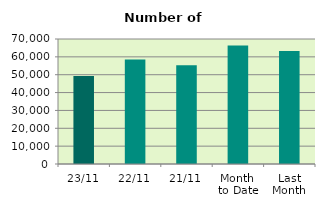
| Category | Series 0 |
|---|---|
| 23/11 | 49308 |
| 22/11 | 58486 |
| 21/11 | 55248 |
| Month 
to Date | 66411.765 |
| Last
Month | 63348.667 |